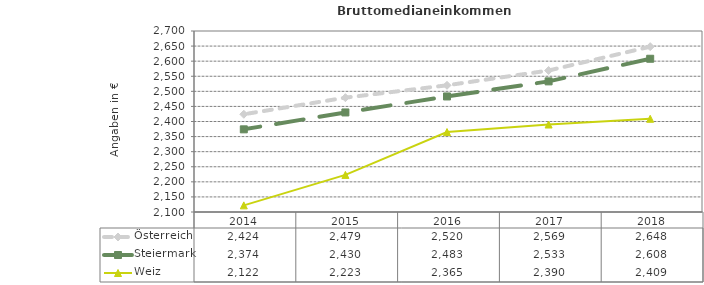
| Category | Österreich | Steiermark | Weiz |
|---|---|---|---|
| 2018.0 | 2648 | 2608 | 2409 |
| 2017.0 | 2569 | 2533 | 2390 |
| 2016.0 | 2520 | 2483 | 2365 |
| 2015.0 | 2479 | 2430 | 2223 |
| 2014.0 | 2424 | 2374 | 2122 |